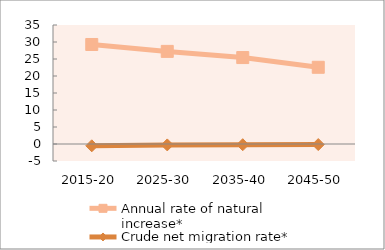
| Category | Annual rate of natural increase* | Crude net migration rate* |
|---|---|---|
| 2015-20 | 29.268 | -0.532 |
| 2025-30 | 27.239 | -0.269 |
| 2035-40 | 25.423 | -0.207 |
| 2045-50 | 22.564 | -0.163 |